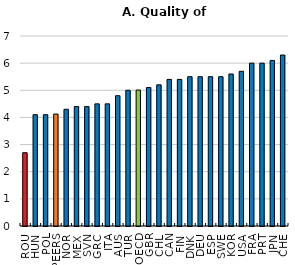
| Category | Series 0 |
|---|---|
| ROU | 2.7 |
| HUN | 4.1 |
| POL | 4.1 |
| PEERS | 4.125 |
| NOR | 4.3 |
| MEX | 4.4 |
| SVN | 4.4 |
| GRC | 4.5 |
| ITA | 4.5 |
| AUS | 4.8 |
| TUR | 5 |
| OECD | 5.008 |
| GBR | 5.1 |
| CHL | 5.2 |
| CAN | 5.4 |
| FIN | 5.4 |
| DNK | 5.5 |
| DEU | 5.5 |
| ESP | 5.5 |
| SWE | 5.5 |
| KOR | 5.6 |
| USA | 5.7 |
| FRA | 6 |
| PRT | 6 |
| JPN | 6.1 |
| CHE | 6.3 |